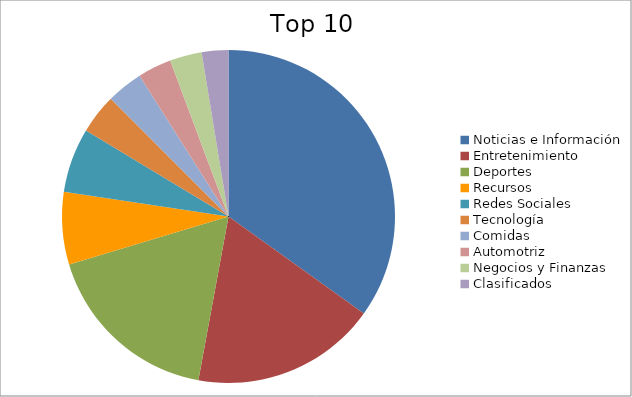
| Category | Series 0 |
|---|---|
| Noticias e Información | 31.56 |
| Entretenimiento | 16.28 |
| Deportes | 15.77 |
| Recursos | 6.37 |
| Redes Sociales | 5.67 |
| Tecnología | 3.49 |
| Comidas | 3.19 |
| Automotriz | 2.96 |
| Negocios y Finanzas | 2.81 |
| Clasificados | 2.34 |